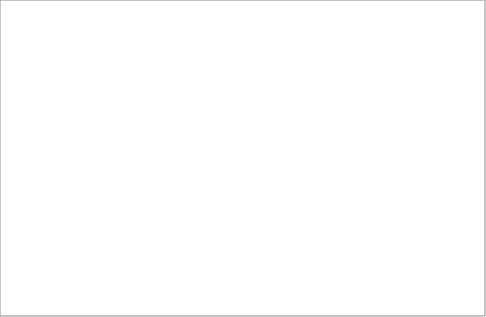
| Category | 2008 | 2009 | 2010 | 2011 | 2012 | 2013 |
|---|---|---|---|---|---|---|
| mazowieckie | 113 | 309 | 227 | 151 | 113 | 128 |